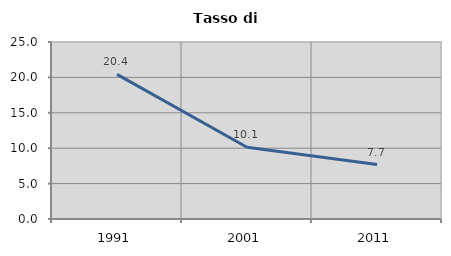
| Category | Tasso di disoccupazione   |
|---|---|
| 1991.0 | 20.423 |
| 2001.0 | 10.135 |
| 2011.0 | 7.692 |